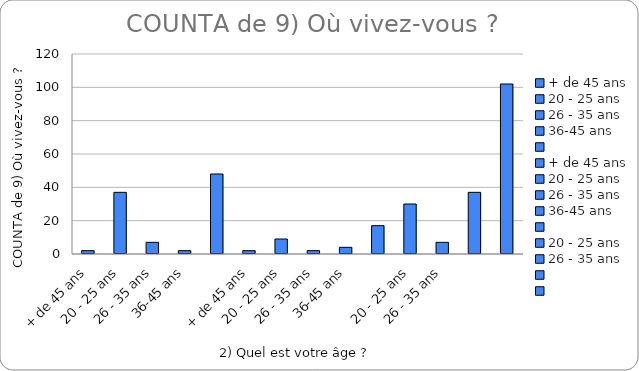
| Category | COUNTA of 9) Où vivez-vous ?  |
|---|---|
| + de 45 ans | 2 |
| 20 - 25 ans | 37 |
| 26 - 35 ans | 7 |
| 36-45 ans | 2 |
|  | 48 |
| + de 45 ans | 2 |
| 20 - 25 ans | 9 |
| 26 - 35 ans | 2 |
| 36-45 ans | 4 |
|  | 17 |
| 20 - 25 ans | 30 |
| 26 - 35 ans | 7 |